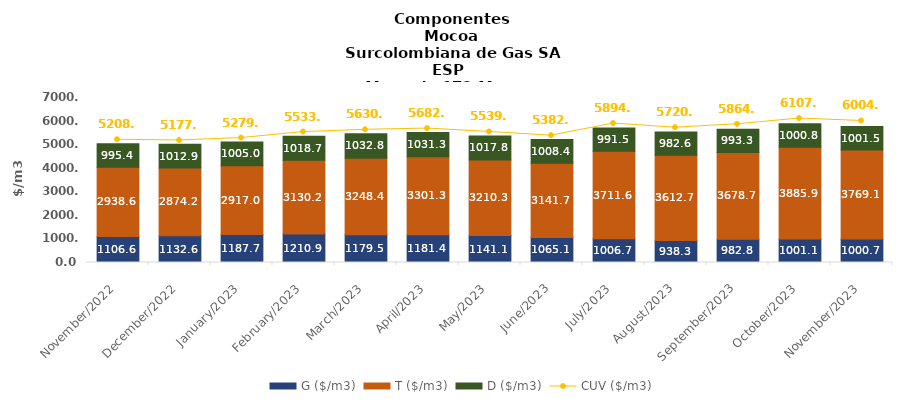
| Category | G ($/m3) | T ($/m3) | D ($/m3) |
|---|---|---|---|
| 2022-11-01 | 1106.58 | 2938.59 | 995.43 |
| 2022-12-01 | 1132.64 | 2874.17 | 1012.88 |
| 2023-01-01 | 1187.7 | 2917.03 | 1005.02 |
| 2023-02-01 | 1210.89 | 3130.19 | 1018.71 |
| 2023-03-01 | 1179.48 | 3248.44 | 1032.83 |
| 2023-04-01 | 1181.36 | 3301.34 | 1031.34 |
| 2023-05-01 | 1141.05 | 3210.28 | 1017.81 |
| 2023-06-01 | 1065.07 | 3141.65 | 1008.39 |
| 2023-07-01 | 1006.71 | 3711.61 | 991.5 |
| 2023-08-01 | 938.29 | 3612.73 | 982.58 |
| 2023-09-01 | 982.76 | 3678.68 | 993.3 |
| 2023-10-01 | 1001.11 | 3885.88 | 1000.84 |
| 2023-11-01 | 1000.74 | 3769.12 | 1001.53 |